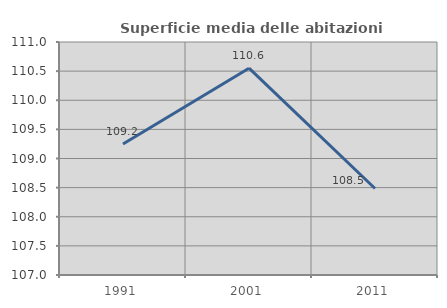
| Category | Superficie media delle abitazioni occupate |
|---|---|
| 1991.0 | 109.248 |
| 2001.0 | 110.55 |
| 2011.0 | 108.485 |